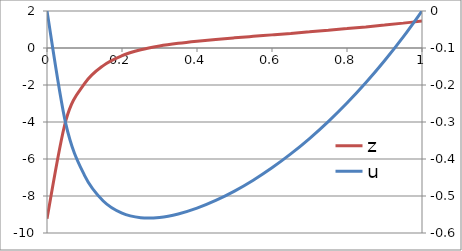
| Category | z |
|---|---|
| 0.0 | -9.224 |
| 0.05 | -3.936 |
| 0.1 | -1.926 |
| 0.15000000000000002 | -0.951 |
| 0.2 | -0.416 |
| 0.25 | -0.096 |
| 0.3 | 0.111 |
| 0.35 | 0.256 |
| 0.39999999999999997 | 0.369 |
| 0.44999999999999996 | 0.463 |
| 0.49999999999999994 | 0.549 |
| 0.5499999999999999 | 0.63 |
| 0.6 | 0.71 |
| 0.65 | 0.79 |
| 0.7000000000000001 | 0.873 |
| 0.7500000000000001 | 0.959 |
| 0.8000000000000002 | 1.048 |
| 0.8500000000000002 | 1.141 |
| 0.9000000000000002 | 1.24 |
| 0.9500000000000003 | 1.345 |
| 1.0 | 1.456 |